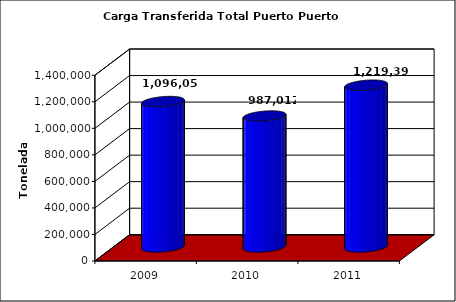
| Category | Series 0 |
|---|---|
| 2009.0 | 1096056 |
| 2010.0 | 987012 |
| 2011.0 | 1219391 |